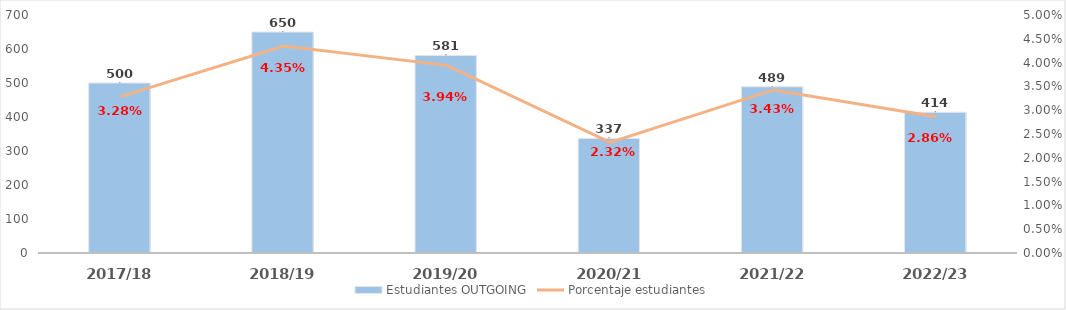
| Category | Estudiantes OUTGOING |
|---|---|
| 2017/18 | 500 |
| 2018/19 | 650 |
| 2019/20 | 581 |
| 2020/21 | 337 |
| 2021/22 | 489 |
| 2022/23 | 414 |